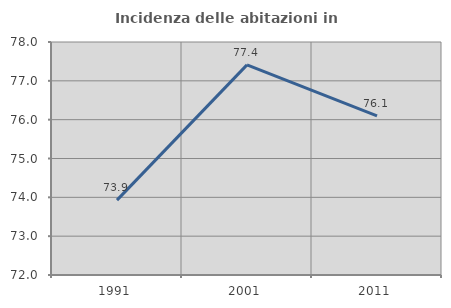
| Category | Incidenza delle abitazioni in proprietà  |
|---|---|
| 1991.0 | 73.929 |
| 2001.0 | 77.41 |
| 2011.0 | 76.098 |